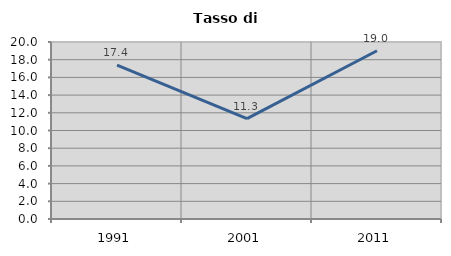
| Category | Tasso di disoccupazione   |
|---|---|
| 1991.0 | 17.377 |
| 2001.0 | 11.335 |
| 2011.0 | 19.006 |